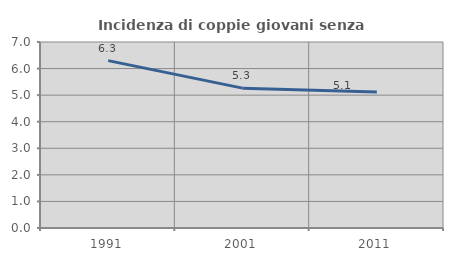
| Category | Incidenza di coppie giovani senza figli |
|---|---|
| 1991.0 | 6.299 |
| 2001.0 | 5.263 |
| 2011.0 | 5.115 |